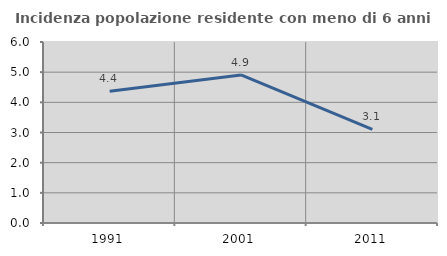
| Category | Incidenza popolazione residente con meno di 6 anni |
|---|---|
| 1991.0 | 4.366 |
| 2001.0 | 4.908 |
| 2011.0 | 3.101 |